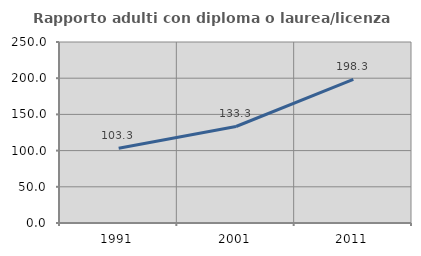
| Category | Rapporto adulti con diploma o laurea/licenza media  |
|---|---|
| 1991.0 | 103.279 |
| 2001.0 | 133.311 |
| 2011.0 | 198.321 |